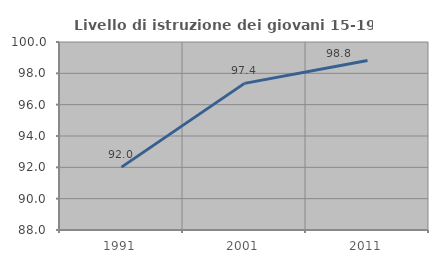
| Category | Livello di istruzione dei giovani 15-19 anni |
|---|---|
| 1991.0 | 92.013 |
| 2001.0 | 97.358 |
| 2011.0 | 98.824 |